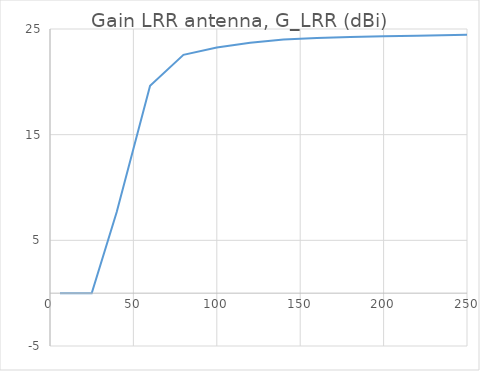
| Category | Gain LRR antenna, G_LRR (dBi) |
|---|---|
| 6.0 | -0.003 |
| 8.0 | -0.003 |
| 10.0 | -0.003 |
| 12.0 | -0.003 |
| 15.0 | -0.003 |
| 20.0 | -0.003 |
| 25.0 | -0.003 |
| 40.0 | 7.686 |
| 60.0 | 19.632 |
| 80.0 | 22.556 |
| 100.0 | 23.245 |
| 120.0 | 23.704 |
| 140.0 | 24.014 |
| 160.0 | 24.137 |
| 180.0 | 24.233 |
| 200.0 | 24.309 |
| 220.0 | 24.372 |
| 250.0 | 24.447 |